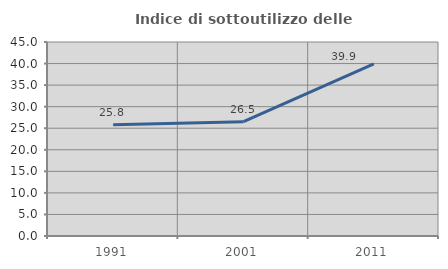
| Category | Indice di sottoutilizzo delle abitazioni  |
|---|---|
| 1991.0 | 25.777 |
| 2001.0 | 26.514 |
| 2011.0 | 39.9 |